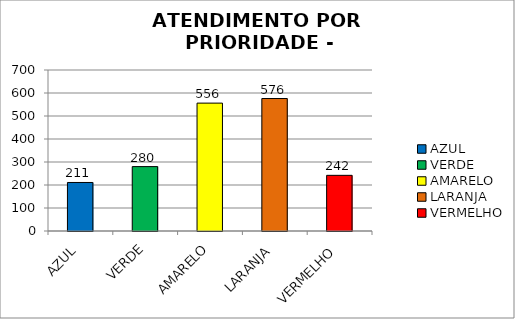
| Category | Total Regional: |
|---|---|
| AZUL | 211 |
| VERDE | 280 |
| AMARELO | 556 |
| LARANJA | 576 |
| VERMELHO | 242 |